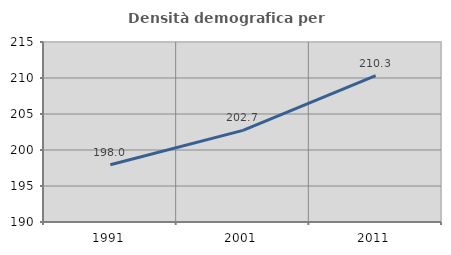
| Category | Densità demografica |
|---|---|
| 1991.0 | 197.958 |
| 2001.0 | 202.727 |
| 2011.0 | 210.326 |